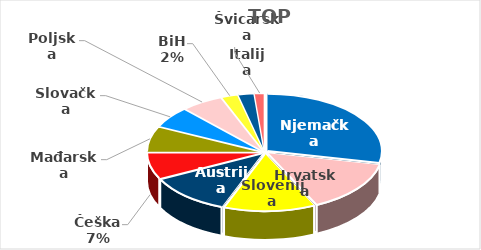
| Category | Series 0 |
|---|---|
| Njemačka | 26.2 |
| Hrvatska | 13.488 |
| Slovenija | 11.9 |
| Austrija | 10.861 |
| Češka | 6.853 |
| Mađarska | 6.675 |
| Slovačka | 5.47 |
| Poljska | 5.447 |
| BiH | 2.161 |
| Italija | 2.074 |
| Švicarska | 1.293 |